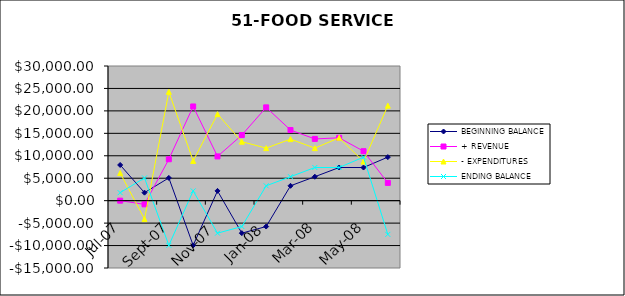
| Category | BEGINNING BALANCE | + REVENUE | - EXPENDITURES | ENDING BALANCE |
|---|---|---|---|---|
| 2007-07-01 | 7949.93 | 0 | 6165.7 | 1784.23 |
| 2007-08-01 | 1784.23 | -817.63 | -4101.93 | 5068.53 |
| 2007-09-01 | 5068.53 | 9223.59 | 24249.36 | -9957.24 |
| 2007-10-01 | -9957.24 | 20985.36 | 8852.12 | 2176 |
| 2007-11-01 | 2176 | 9858.65 | 19272.61 | -7237.96 |
| 2007-12-01 | -7237.96 | 14612.86 | 13140.05 | -5765.15 |
| 2008-01-01 | -5765.15 | 20781.66 | 11704.91 | 3311.6 |
| 2008-02-01 | 3311.6 | 15736.2 | 13711 | 5336.8 |
| 2008-03-01 | 5336.8 | 13752.43 | 11702.35 | 7386.88 |
| 2008-04-01 | 7386.88 | 14002.91 | 14006.06 | 7383.73 |
| 2008-05-01 | 7383.73 | 11019.95 | 8702.6 | 9701.08 |
| 2008-06-01 | 9701.08 | 3958.18 | 21172.2 | -7512.94 |